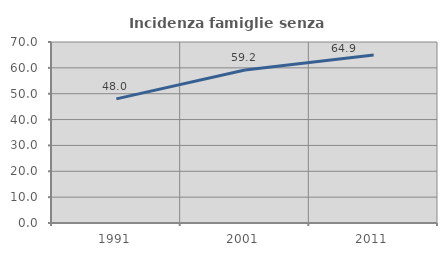
| Category | Incidenza famiglie senza nuclei |
|---|---|
| 1991.0 | 48 |
| 2001.0 | 59.184 |
| 2011.0 | 64.935 |